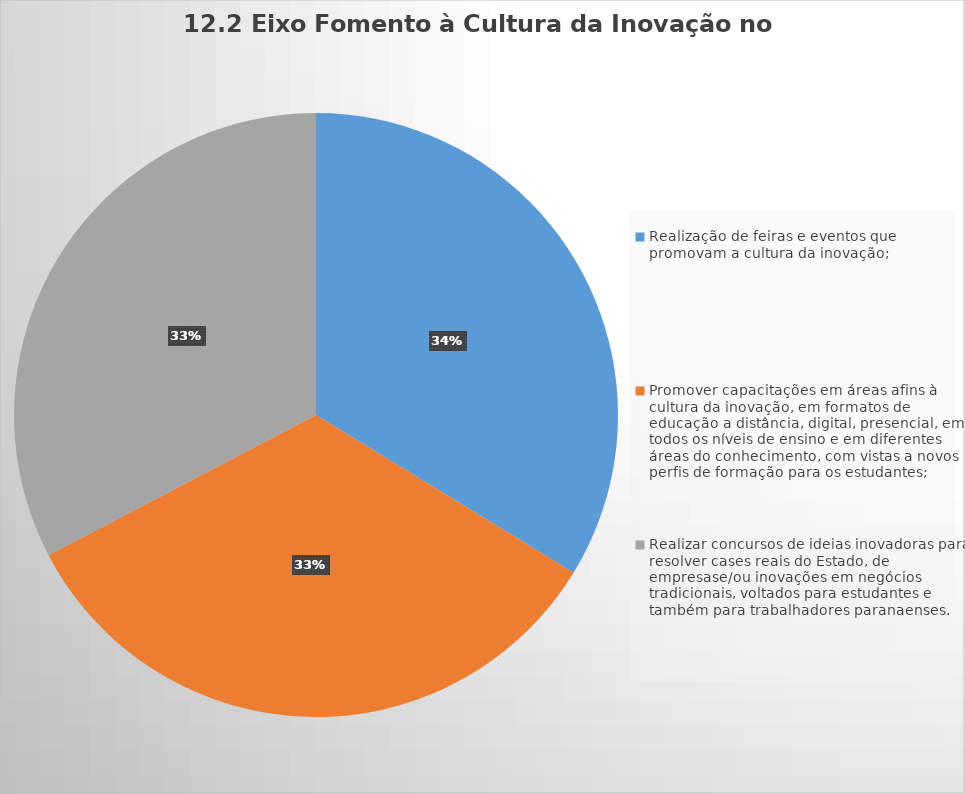
| Category | Series 0 |
|---|---|
| Realização de feiras e eventos que promovam a cultura da inovação;‬ | 192 |
| Promover capacitações em áreas afins à cultura da inovação, em formatos de educação a distância, digital, presencial, em todos os níveis de ensino e em diferentes áreas do conhecimento, com vistas a novos perfis de formação para os estudantes; | 191 |
| Realizar‬ ‭concursos‬ ‭de‬‭ ideias ‬‭inovadoras ‬‭para ‬‭resolver ‬‭cases ‬‭reais ‬‭do ‬‭Estado, ‬‭de ‬‭empresas‬‭e/ou‬ inovações‬ ‭em‬ ‭negócios‬ ‭tradicionais,‬ ‭voltados‬ ‭para‬ ‭estudantes‬ ‭e‬ ‭também‬ ‭para‬ ‭trabalhadores‬ paranaenses. | 186 |